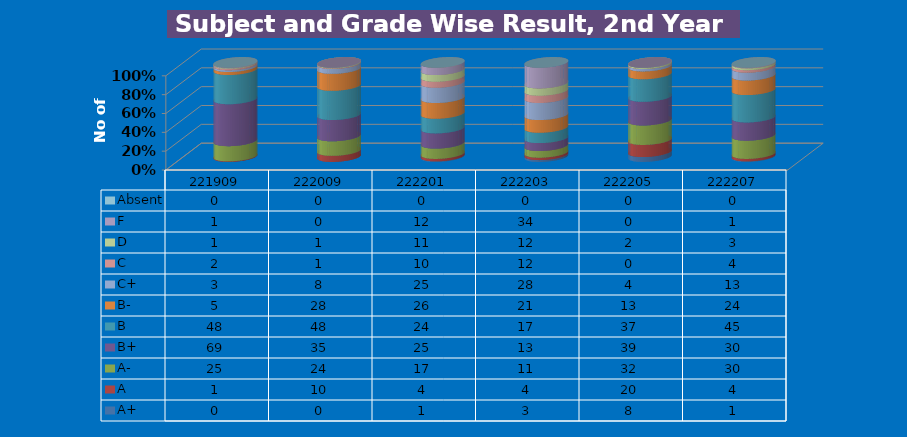
| Category | A+ | A | A- | B+ | B | B- | C+ | C | D | F | Absent |
|---|---|---|---|---|---|---|---|---|---|---|---|
| 221909.0 | 0 | 1 | 25 | 69 | 48 | 5 | 3 | 2 | 1 | 1 | 0 |
| 222009.0 | 0 | 10 | 24 | 35 | 48 | 28 | 8 | 1 | 1 | 0 | 0 |
| 222201.0 | 1 | 4 | 17 | 25 | 24 | 26 | 25 | 10 | 11 | 12 | 0 |
| 222203.0 | 3 | 4 | 11 | 13 | 17 | 21 | 28 | 12 | 12 | 34 | 0 |
| 222205.0 | 8 | 20 | 32 | 39 | 37 | 13 | 4 | 0 | 2 | 0 | 0 |
| 222207.0 | 1 | 4 | 30 | 30 | 45 | 24 | 13 | 4 | 3 | 1 | 0 |